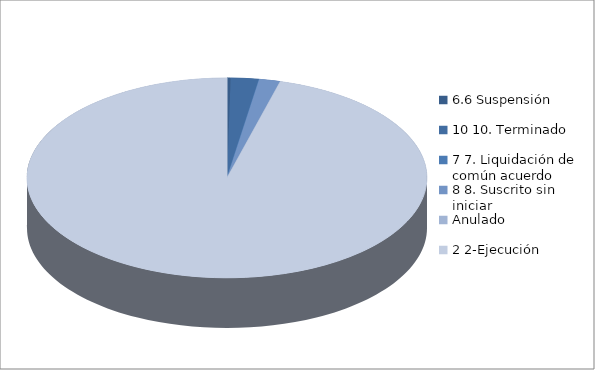
| Category | Series 0 |
|---|---|
| 6.6 Suspensión | 1 |
| 10 10. Terminado | 8 |
| 7 7. Liquidación de común acuerdo | 0 |
| 8 8. Suscrito sin iniciar | 6 |
| Anulado | 0 |
| 2 2-Ejecución | 335 |